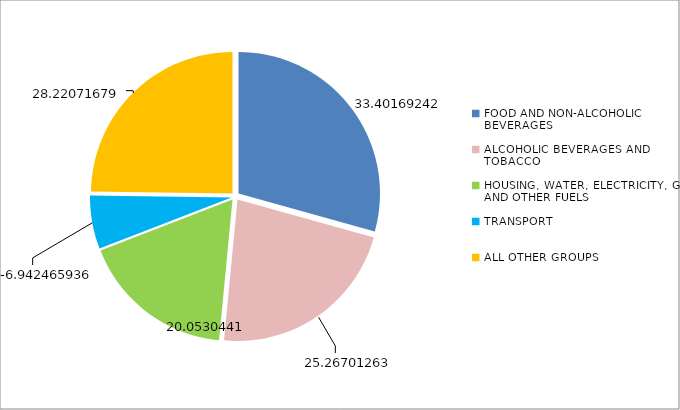
| Category | Series 0 |
|---|---|
| FOOD AND NON-ALCOHOLIC BEVERAGES  | 33.402 |
| ALCOHOLIC BEVERAGES AND TOBACCO | 25.267 |
| HOUSING, WATER, ELECTRICITY, GAS AND OTHER FUELS | 20.053 |
| TRANSPORT | -6.942 |
| ALL OTHER GROUPS | 28.221 |